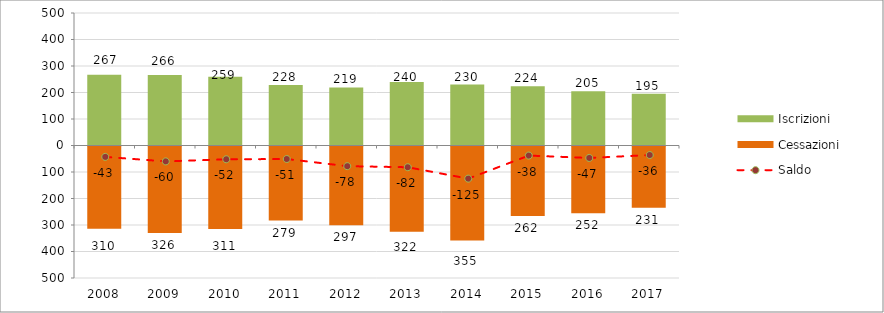
| Category | Iscrizioni | Cessazioni |
|---|---|---|
| 2008.0 | 267 | -310 |
| 2009.0 | 266 | -326 |
| 2010.0 | 259 | -311 |
| 2011.0 | 228 | -279 |
| 2012.0 | 219 | -297 |
| 2013.0 | 240 | -322 |
| 2014.0 | 230 | -355 |
| 2015.0 | 224 | -262 |
| 2016.0 | 205 | -252 |
| 2017.0 | 195 | -231 |